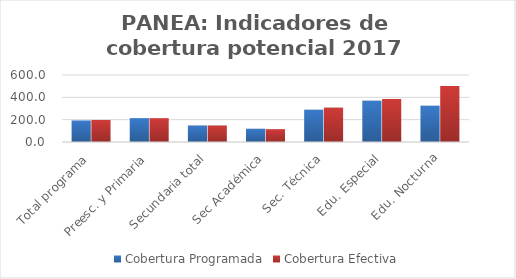
| Category | Cobertura Programada | Cobertura Efectiva |
|---|---|---|
| Total programa | 192.927 | 197.321 |
| Preesc. y Primaria | 213.917 | 213.477 |
| Secundaria total | 147.556 | 147.731 |
| Sec Académica | 118.66 | 115.066 |
| Sec. Técnica | 289.253 | 307.912 |
| Edu. Especial | 370.043 | 385.368 |
| Edu. Nocturna | 325.16 | 501.217 |